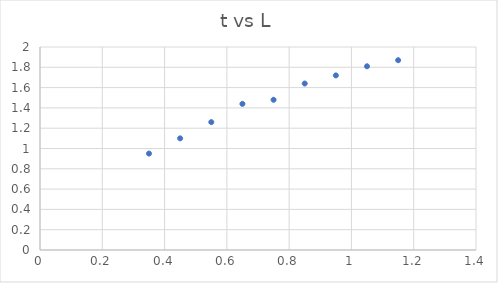
| Category | Series 0 |
|---|---|
| 1.15 | 1.87 |
| 1.05 | 1.81 |
| 0.95 | 1.72 |
| 0.85 | 1.64 |
| 0.75 | 1.48 |
| 0.65 | 1.44 |
| 0.55 | 1.26 |
| 0.45 | 1.1 |
| 0.35 | 0.95 |